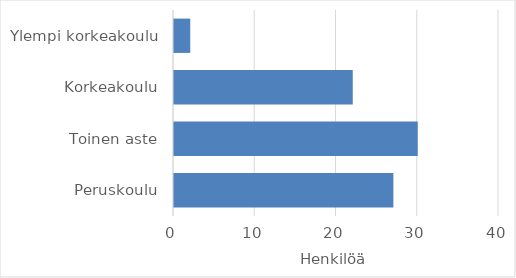
| Category | Series 0 |
|---|---|
| Peruskoulu | 27 |
| Toinen aste | 30 |
| Korkeakoulu | 22 |
| Ylempi korkeakoulu | 2 |